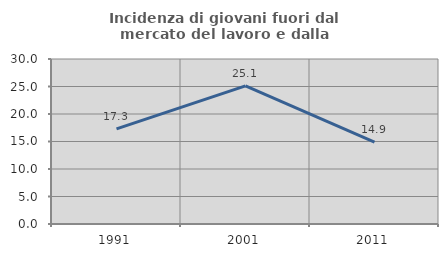
| Category | Incidenza di giovani fuori dal mercato del lavoro e dalla formazione  |
|---|---|
| 1991.0 | 17.3 |
| 2001.0 | 25.119 |
| 2011.0 | 14.876 |